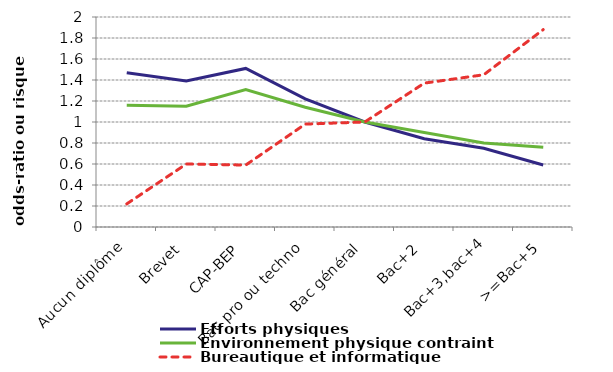
| Category | Efforts physiques | Environnement physique contraint | Bureautique et informatique |
|---|---|---|---|
| Aucun diplôme | 1.47 | 1.16 | 0.22 |
| Brevet | 1.39 | 1.15 | 0.6 |
| CAP-BEP | 1.51 | 1.31 | 0.59 |
| Bac pro ou techno | 1.22 | 1.14 | 0.98 |
| Bac général | 1 | 1 | 1 |
| Bac+2 | 0.84 | 0.9 | 1.37 |
| Bac+3,bac+4 | 0.75 | 0.8 | 1.45 |
| >=Bac+5 | 0.59 | 0.76 | 1.88 |